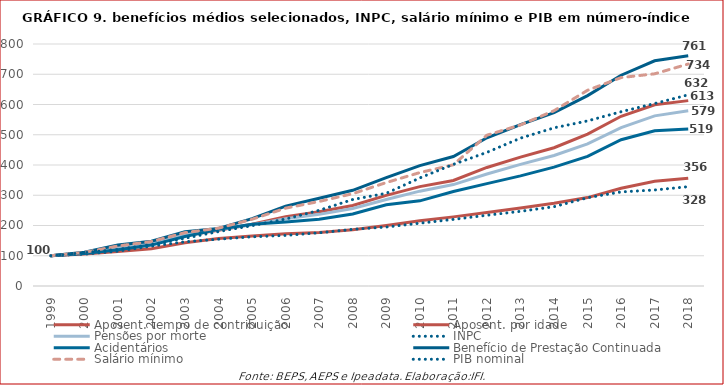
| Category | Aposent. tempo de contribuição | Aposent. por idade | Pensões por morte | INPC | Acidentários | Benefício de Prestação Continuada | Salário mínimo | PIB nominal |
|---|---|---|---|---|---|---|---|---|
| 1999.0 | 100 | 100 | 100 | 100 | 100 | 100 | 100 | 100 |
| 2000.0 | 105.657 | 109.128 | 109.579 | 105.273 | 107.463 | 111.412 | 111.029 | 110.24 |
| 2001.0 | 114.063 | 127.27 | 125.654 | 115.212 | 119.755 | 135.496 | 132.353 | 120.966 |
| 2002.0 | 123.053 | 141.397 | 140.686 | 132.194 | 135.242 | 147.923 | 147.059 | 136.873 |
| 2003.0 | 142.938 | 166.768 | 167.531 | 145.921 | 163.855 | 179.467 | 176.471 | 157.942 |
| 2004.0 | 157.065 | 184.424 | 186.55 | 154.87 | 187.159 | 190.003 | 191.176 | 179.988 |
| 2005.0 | 165.539 | 204.412 | 202.298 | 162.686 | 203.896 | 222.511 | 220.588 | 199.555 |
| 2006.0 | 172.457 | 229.164 | 222.401 | 167.263 | 211.794 | 264.207 | 257.353 | 221.516 |
| 2007.0 | 176.714 | 245.622 | 236.833 | 175.886 | 221.035 | 290.132 | 279.412 | 250.091 |
| 2008.0 | 186.198 | 266.264 | 256.48 | 187.285 | 238.028 | 316.407 | 305.147 | 285.904 |
| 2009.0 | 199.985 | 299.496 | 285.772 | 194.989 | 268.457 | 358.558 | 341.912 | 306.427 |
| 2010.0 | 215.421 | 328.595 | 313.516 | 207.596 | 281.494 | 398.063 | 375 | 357.25 |
| 2011.0 | 228.51 | 348.99 | 335.29 | 220.218 | 312.598 | 428.137 | 400.735 | 402.098 |
| 2012.0 | 242.857 | 391.849 | 370.201 | 233.865 | 338.476 | 489.885 | 498.529 | 441.838 |
| 2013.0 | 257.752 | 426.025 | 401.935 | 246.875 | 364.051 | 533.691 | 532.353 | 488.775 |
| 2014.0 | 273.326 | 457.115 | 431.266 | 262.251 | 392.879 | 573.017 | 579.412 | 522.87 |
| 2015.0 | 292.274 | 502.253 | 469.528 | 291.823 | 428.516 | 629.356 | 647.059 | 545.796 |
| 2016.0 | 323.317 | 561.1 | 523.767 | 311.024 | 483.575 | 696.748 | 688.971 | 576.093 |
| 2017.0 | 345.919 | 599.22 | 562.506 | 317.463 | 512.924 | 744.535 | 701.471 | 603.255 |
| 2018.0 | 356.492 | 612.822 | 579.18 | 328.352 | 519.05 | 761.306 | 733.824 | 631.941 |